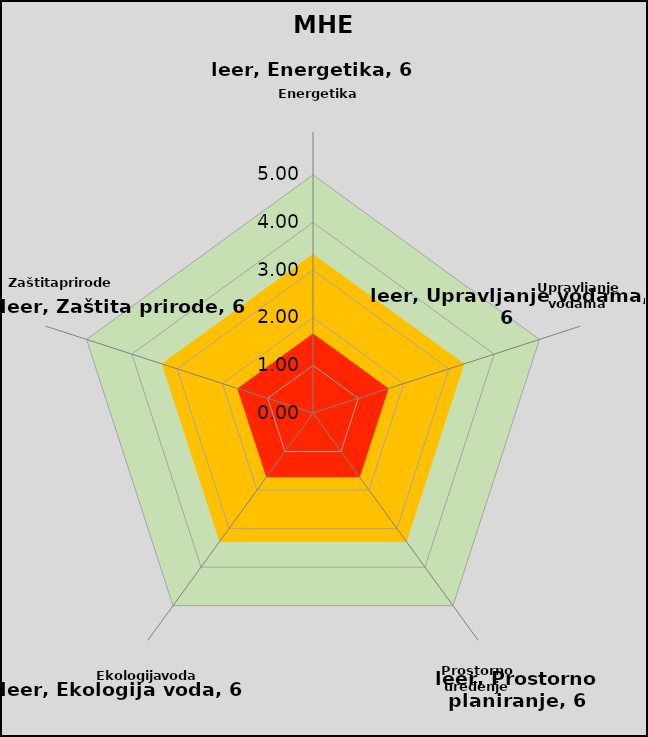
| Category | Zeleno | Narandžasto | Crveno | dummy | Rezultat | 5 | 4 | 3 | 2 | 1 | leer |
|---|---|---|---|---|---|---|---|---|---|---|---|
| Energetika | 5 | 3.34 | 1.67 | 5 | 0 | 5 | 4 | 3 | 2 | 1 | 6 |
| Upravljanje vodama | 5 | 3.34 | 1.67 | 5 | 0 | 5 | 4 | 3 | 2 | 1 | 6 |
| Prostorno planiranje | 5 | 3.34 | 1.67 | 5 | 0 | 5 | 4 | 3 | 2 | 1 | 6 |
| Ekologija voda | 5 | 3.34 | 1.67 | 5 | 0 | 5 | 4 | 3 | 2 | 1 | 6 |
| Zaštita prirode | 5 | 3.34 | 1.67 | 5 | 0 | 5 | 4 | 3 | 2 | 1 | 6 |